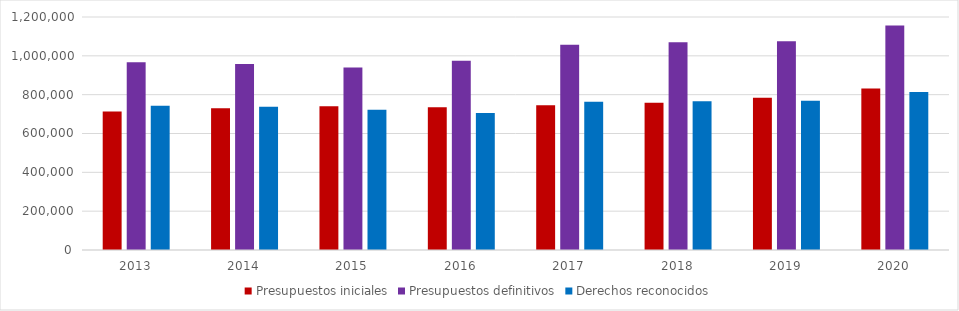
| Category | Presupuestos iniciales | Presupuestos definitivos | Derechos reconocidos |
|---|---|---|---|
| 2013.0 | 713002.158 | 967156 | 742941 |
| 2014.0 | 729663.12 | 958102.457 | 737702.75 |
| 2015.0 | 740573.085 | 939368.212 | 722456.445 |
| 2016.0 | 735782 | 974477.812 | 705665.92 |
| 2017.0 | 745416 | 1056554.578 | 763665.238 |
| 2018.0 | 757960 | 1070125.118 | 766684.769 |
| 2019.0 | 783849.823 | 1074954.164 | 768290.856 |
| 2020.0 | 831800 | 1156412.011 | 813748.748 |